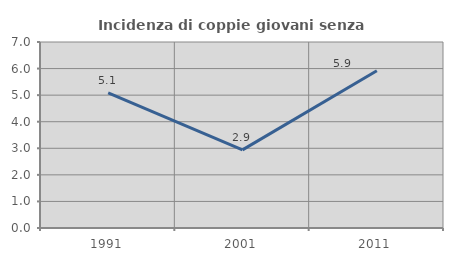
| Category | Incidenza di coppie giovani senza figli |
|---|---|
| 1991.0 | 5.085 |
| 2001.0 | 2.941 |
| 2011.0 | 5.921 |